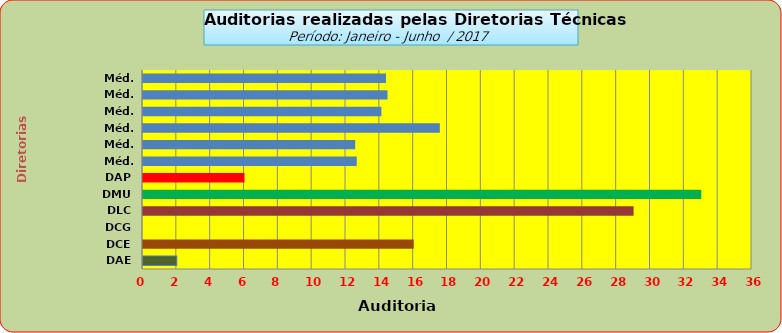
| Category | Series 0 |
|---|---|
| DAE | 2 |
| DCE | 16 |
| DCG | 0 |
| DLC | 29 |
| DMU | 33 |
| DAP | 6 |
| Méd. 2011 | 12.636 |
| Méd. 2012 | 12.545 |
| Méd. 2013 | 17.545 |
| Méd. 2014 | 14.091 |
| Méd. 2015 | 14.455 |
| Méd. 2016 | 14.364 |